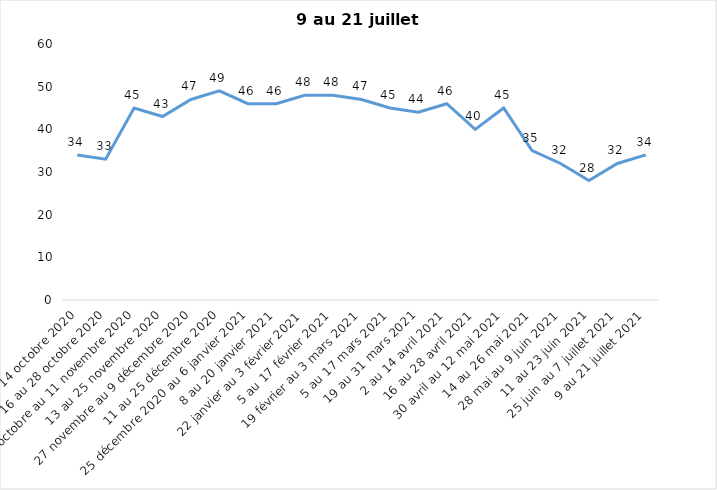
| Category | Toujours aux trois mesures |
|---|---|
| 2 au 14 octobre 2020 | 34 |
| 16 au 28 octobre 2020 | 33 |
| 30 octobre au 11 novembre 2020 | 45 |
| 13 au 25 novembre 2020 | 43 |
| 27 novembre au 9 décembre 2020 | 47 |
| 11 au 25 décembre 2020 | 49 |
| 25 décembre 2020 au 6 janvier 2021 | 46 |
| 8 au 20 janvier 2021 | 46 |
| 22 janvier au 3 février 2021 | 48 |
| 5 au 17 février 2021 | 48 |
| 19 février au 3 mars 2021 | 47 |
| 5 au 17 mars 2021 | 45 |
| 19 au 31 mars 2021 | 44 |
| 2 au 14 avril 2021 | 46 |
| 16 au 28 avril 2021 | 40 |
| 30 avril au 12 mai 2021 | 45 |
| 14 au 26 mai 2021 | 35 |
| 28 mai au 9 juin 2021 | 32 |
| 11 au 23 juin 2021 | 28 |
| 25 juin au 7 juillet 2021 | 32 |
| 9 au 21 juillet 2021 | 34 |